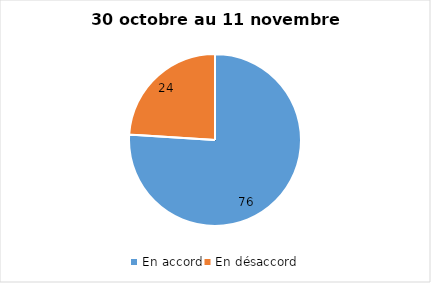
| Category | Series 0 |
|---|---|
| En accord | 76 |
| En désaccord | 24 |